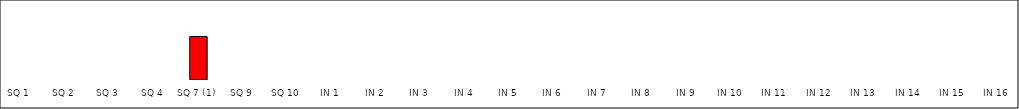
| Category | Series 0 |
|---|---|
| SQ 1 | 0 |
| SQ 2 | 0 |
| SQ 3 | 0 |
| SQ 4 | 0 |
| SQ 7 (1) | 1 |
| SQ 9 | 0 |
| SQ 10 | 0 |
| IN 1 | 0 |
| IN 2 | 0 |
| IN 3 | 0 |
| IN 4 | 0 |
| IN 5 | 0 |
| IN 6 | 0 |
| IN 7 | 0 |
| IN 8 | 0 |
| IN 9 | 0 |
| IN 10 | 0 |
| IN 11 | 0 |
| IN 12 | 0 |
| IN 13 | 0 |
| IN 14 | 0 |
| IN 15 | 0 |
| IN 16 | 0 |